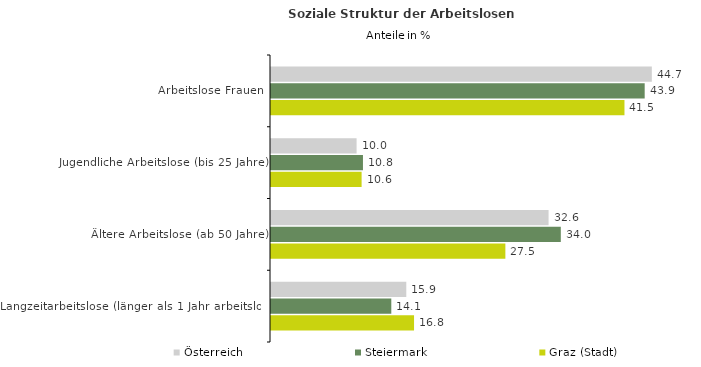
| Category | Österreich | Steiermark | Graz (Stadt) |
|---|---|---|---|
| Arbeitslose Frauen | 44.699 | 43.86 | 41.487 |
| Jugendliche Arbeitslose (bis 25 Jahre) | 10.046 | 10.794 | 10.634 |
| Ältere Arbeitslose (ab 50 Jahre) | 32.578 | 34.015 | 27.508 |
| Langzeitarbeitslose (länger als 1 Jahr arbeitslos) | 15.879 | 14.12 | 16.789 |